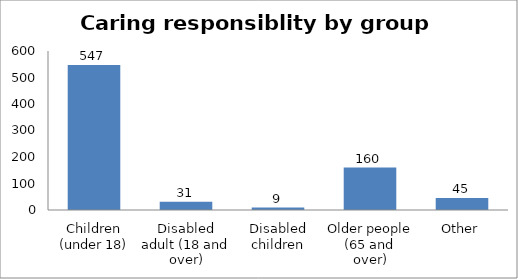
| Category | Series 0 |
|---|---|
| Children (under 18) | 547 |
| Disabled adult (18 and over) | 31 |
| Disabled children | 9 |
| Older people (65 and over) | 160 |
| Other | 45 |